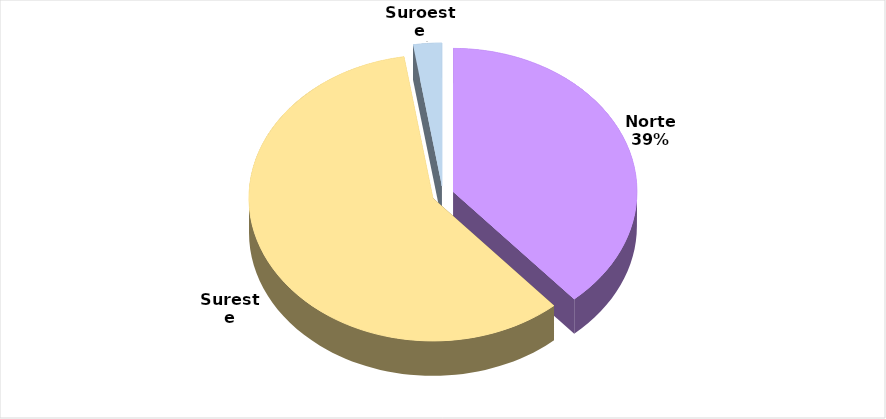
| Category | CANTIDAD |
|---|---|
| Norte | 138 |
| Sureste | 211 |
| Suroeste | 9 |